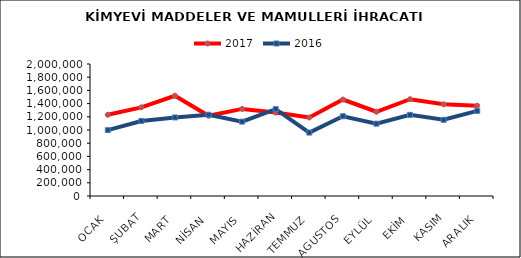
| Category | 2017 | 2016 |
|---|---|---|
| OCAK | 1230602.642 | 997796.811 |
| ŞUBAT | 1343479.405 | 1136925.47 |
| MART | 1518912.879 | 1189665.079 |
| NİSAN | 1214990.854 | 1231357.038 |
| MAYIS | 1319550.824 | 1126912.423 |
| HAZİRAN | 1264152.342 | 1316130.679 |
| TEMMUZ | 1189553.581 | 960628.121 |
| AGUSTOS | 1461473.54 | 1208479.221 |
| EYLÜL | 1276505.851 | 1095813.633 |
| EKİM | 1466551.624 | 1228933.096 |
| KASIM | 1388813.815 | 1154551.954 |
| ARALIK | 1367630.758 | 1289586.687 |